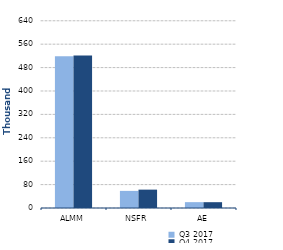
| Category | Q3 2017 | Q4 2017 |
|---|---|---|
| 0 | 519001 | 521056 |
| 1 | 58455 | 62779 |
| 2 | 20010 | 19871 |